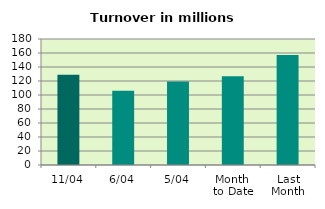
| Category | Series 0 |
|---|---|
| 11/04 | 128.758 |
| 6/04 | 106.216 |
| 5/04 | 119.328 |
| Month 
to Date | 126.649 |
| Last
Month | 157.238 |